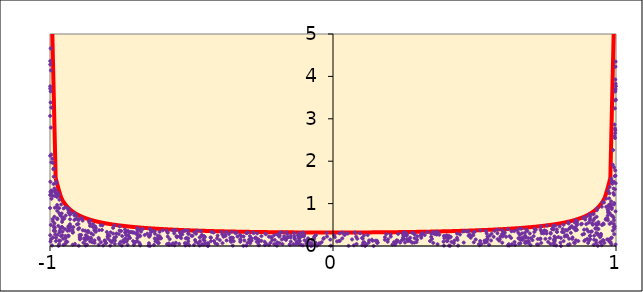
| Category | density function |
|---|---|
| -0.999 | 7.119 |
| -0.98 | 1.6 |
| -0.96 | 1.137 |
| -0.94 | 0.933 |
| -0.92 | 0.812 |
| -0.9 | 0.73 |
| -0.88 | 0.67 |
| -0.86 | 0.624 |
| -0.84 | 0.587 |
| -0.82 | 0.556 |
| -0.8 | 0.531 |
| -0.78 | 0.509 |
| -0.76 | 0.49 |
| -0.74 | 0.473 |
| -0.72 | 0.459 |
| -0.7 | 0.446 |
| -0.68 | 0.434 |
| -0.66 | 0.424 |
| -0.64 | 0.414 |
| -0.62 | 0.406 |
| -0.6 | 0.398 |
| -0.58 | 0.391 |
| -0.56 | 0.384 |
| -0.54 | 0.378 |
| -0.52 | 0.373 |
| -0.5 | 0.368 |
| -0.48 | 0.363 |
| -0.46 | 0.358 |
| -0.44 | 0.354 |
| -0.419999999999999 | 0.351 |
| -0.399999999999999 | 0.347 |
| -0.379999999999999 | 0.344 |
| -0.359999999999999 | 0.341 |
| -0.339999999999999 | 0.338 |
| -0.319999999999999 | 0.336 |
| -0.299999999999999 | 0.334 |
| -0.279999999999999 | 0.332 |
| -0.259999999999999 | 0.33 |
| -0.239999999999999 | 0.328 |
| -0.219999999999999 | 0.326 |
| -0.199999999999999 | 0.325 |
| -0.179999999999999 | 0.324 |
| -0.159999999999999 | 0.322 |
| -0.139999999999999 | 0.321 |
| -0.119999999999999 | 0.321 |
| -0.099999999999999 | 0.32 |
| -0.079999999999999 | 0.319 |
| -0.0599999999999991 | 0.319 |
| -0.039999999999999 | 0.319 |
| -0.019999999999999 | 0.318 |
| 0.0 | 0.318 |
| 0.02 | 0.318 |
| 0.04 | 0.319 |
| 0.0600000000000001 | 0.319 |
| 0.0800000000000001 | 0.319 |
| 0.1 | 0.32 |
| 0.12 | 0.321 |
| 0.14 | 0.321 |
| 0.16 | 0.322 |
| 0.18 | 0.324 |
| 0.2 | 0.325 |
| 0.22 | 0.326 |
| 0.24 | 0.328 |
| 0.26 | 0.33 |
| 0.28 | 0.332 |
| 0.3 | 0.334 |
| 0.32 | 0.336 |
| 0.34 | 0.338 |
| 0.36 | 0.341 |
| 0.38 | 0.344 |
| 0.4 | 0.347 |
| 0.42 | 0.351 |
| 0.44 | 0.354 |
| 0.46 | 0.358 |
| 0.48 | 0.363 |
| 0.5 | 0.368 |
| 0.52 | 0.373 |
| 0.54 | 0.378 |
| 0.56 | 0.384 |
| 0.58 | 0.391 |
| 0.6 | 0.398 |
| 0.62 | 0.406 |
| 0.64 | 0.414 |
| 0.66 | 0.424 |
| 0.68 | 0.434 |
| 0.7 | 0.446 |
| 0.72 | 0.459 |
| 0.74 | 0.473 |
| 0.76 | 0.49 |
| 0.78 | 0.509 |
| 0.8 | 0.531 |
| 0.82 | 0.556 |
| 0.84 | 0.587 |
| 0.86 | 0.624 |
| 0.88 | 0.67 |
| 0.9 | 0.73 |
| 0.92 | 0.812 |
| 0.94 | 0.933 |
| 0.96 | 1.137 |
| 0.98 | 1.6 |
| 0.999 | 7.119 |